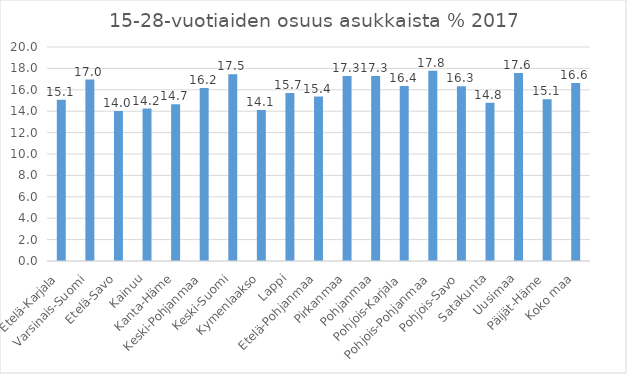
| Category | 15-28-vuotiaiden osuus asukkaista % |
|---|---|
| Etelä-Karjala | 15.061 |
| Varsinais-Suomi | 16.957 |
| Etelä-Savo | 14.022 |
| Kainuu | 14.248 |
| Kanta-Häme | 14.651 |
| Keski-Pohjanmaa | 16.176 |
| Keski-Suomi | 17.459 |
| Kymenlaakso | 14.122 |
| Lappi | 15.69 |
| Etelä-Pohjanmaa | 15.366 |
| Pirkanmaa | 17.285 |
| Pohjanmaa | 17.288 |
| Pohjois-Karjala | 16.36 |
| Pohjois-Pohjanmaa | 17.769 |
| Pohjois-Savo | 16.337 |
| Satakunta | 14.792 |
| Uusimaa | 17.565 |
| Päijät-Häme | 15.121 |
| Koko maa | 16.631 |